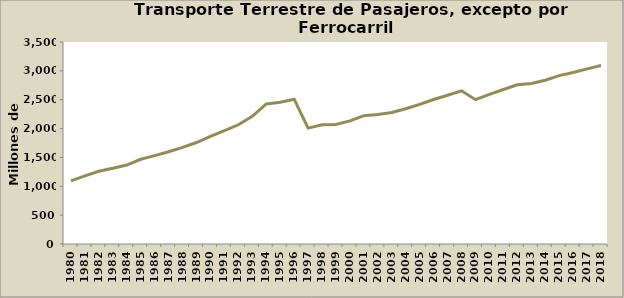
| Category | Series 0 |
|---|---|
| 1980.0 | 1094 |
| 1981.0 | 1180 |
| 1982.0 | 1261 |
| 1983.0 | 1312 |
| 1984.0 | 1368 |
| 1985.0 | 1468 |
| 1986.0 | 1531 |
| 1987.0 | 1599 |
| 1988.0 | 1673 |
| 1989.0 | 1758 |
| 1990.0 | 1865 |
| 1991.0 | 1965 |
| 1992.0 | 2066 |
| 1993.0 | 2212 |
| 1994.0 | 2426 |
| 1995.0 | 2457 |
| 1996.0 | 2509 |
| 1997.0 | 2008 |
| 1998.0 | 2065 |
| 1999.0 | 2070 |
| 2000.0 | 2134 |
| 2001.0 | 2224 |
| 2002.0 | 2245 |
| 2003.0 | 2279 |
| 2004.0 | 2344 |
| 2005.0 | 2418 |
| 2006.0 | 2503 |
| 2007.0 | 2578 |
| 2008.0 | 2655 |
| 2009.0 | 2501 |
| 2010.0 | 2591 |
| 2011.0 | 2677 |
| 2012.0 | 2758 |
| 2013.0 | 2781 |
| 2014.0 | 2836.795 |
| 2015.0 | 2918 |
| 2016.0 | 2970.86 |
| 2017.0 | 3034.82 |
| 2018.0 | 3093.86 |